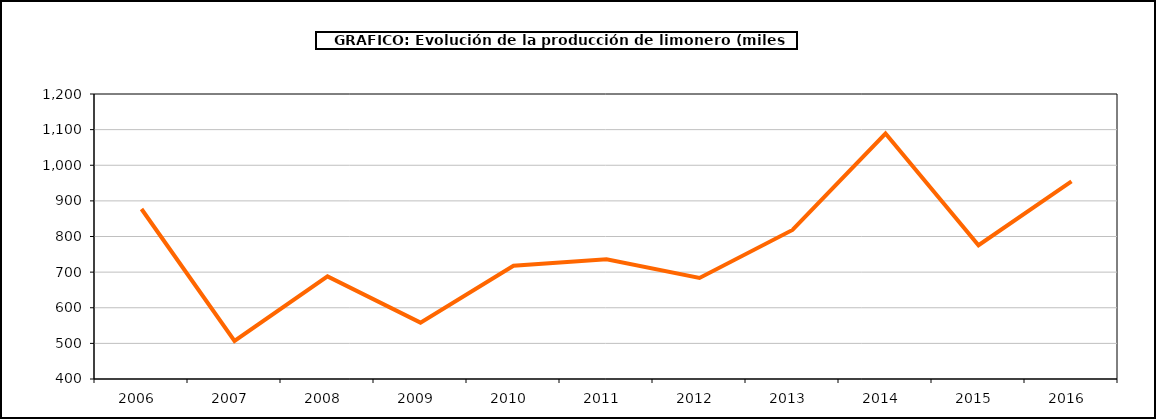
| Category | producción |
|---|---|
| 2006.0 | 877.134 |
| 2007.0 | 506.699 |
| 2008.0 | 687.936 |
| 2009.0 | 558.18 |
| 2010.0 | 717.906 |
| 2011.0 | 736.198 |
| 2012.0 | 683.604 |
| 2013.0 | 818.489 |
| 2014.0 | 1088.964 |
| 2015.0 | 775.546 |
| 2016.0 | 954.479 |